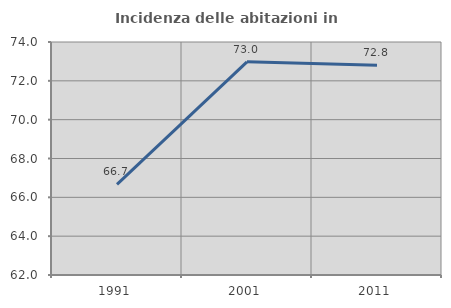
| Category | Incidenza delle abitazioni in proprietà  |
|---|---|
| 1991.0 | 66.664 |
| 2001.0 | 72.98 |
| 2011.0 | 72.808 |